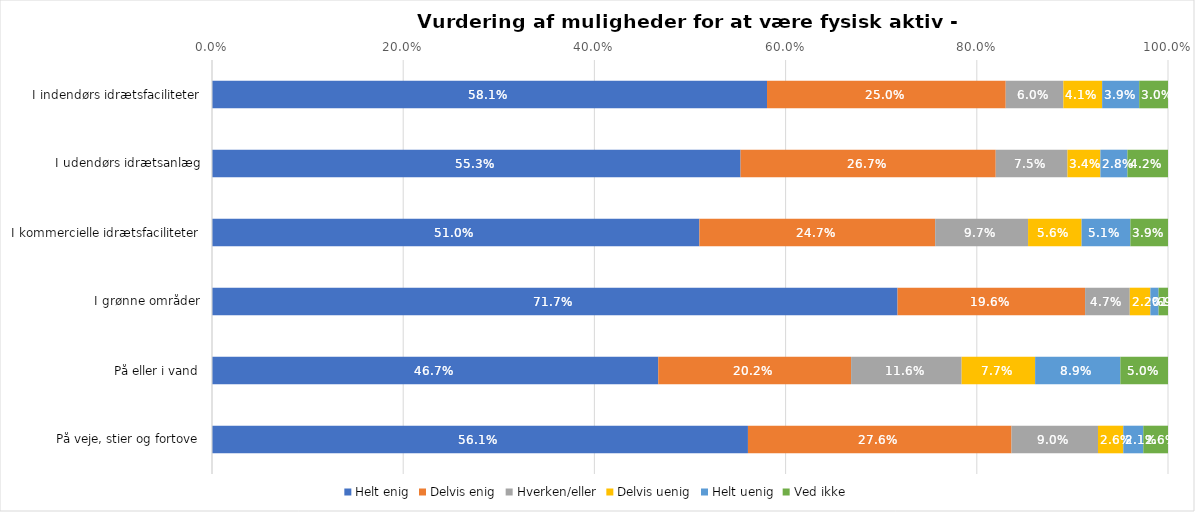
| Category | Helt enig | Delvis enig | Hverken/eller | Delvis uenig | Helt uenig | Ved ikke |
|---|---|---|---|---|---|---|
| I indendørs idrætsfaciliteter | 0.581 | 0.25 | 0.06 | 0.041 | 0.039 | 0.03 |
| I udendørs idrætsanlæg | 0.553 | 0.267 | 0.075 | 0.034 | 0.028 | 0.042 |
| I kommercielle idrætsfaciliteter | 0.51 | 0.247 | 0.097 | 0.056 | 0.051 | 0.039 |
| I grønne områder | 0.717 | 0.196 | 0.047 | 0.022 | 0.009 | 0.01 |
| På eller i vand | 0.467 | 0.202 | 0.116 | 0.077 | 0.089 | 0.05 |
| På veje, stier og fortove | 0.561 | 0.276 | 0.09 | 0.026 | 0.021 | 0.026 |